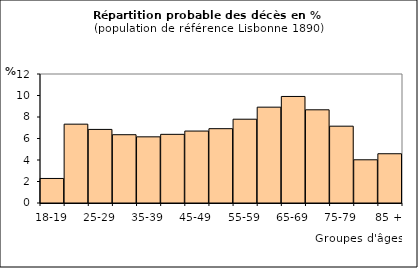
| Category | Series 0 |
|---|---|
| 18-19 | 2.283 |
| 20-24 | 7.334 |
| 25-29 | 6.845 |
| 30-34 | 6.353 |
| 35-39 | 6.155 |
| 40-44 | 6.387 |
| 45-49 | 6.693 |
| 50-54 | 6.914 |
| 55-59 | 7.795 |
| 60-64 | 8.914 |
| 65-69 | 9.91 |
| 70-74 | 8.669 |
| 75-79 | 7.146 |
| 80-84 | 4.019 |
| 85 + | 4.582 |